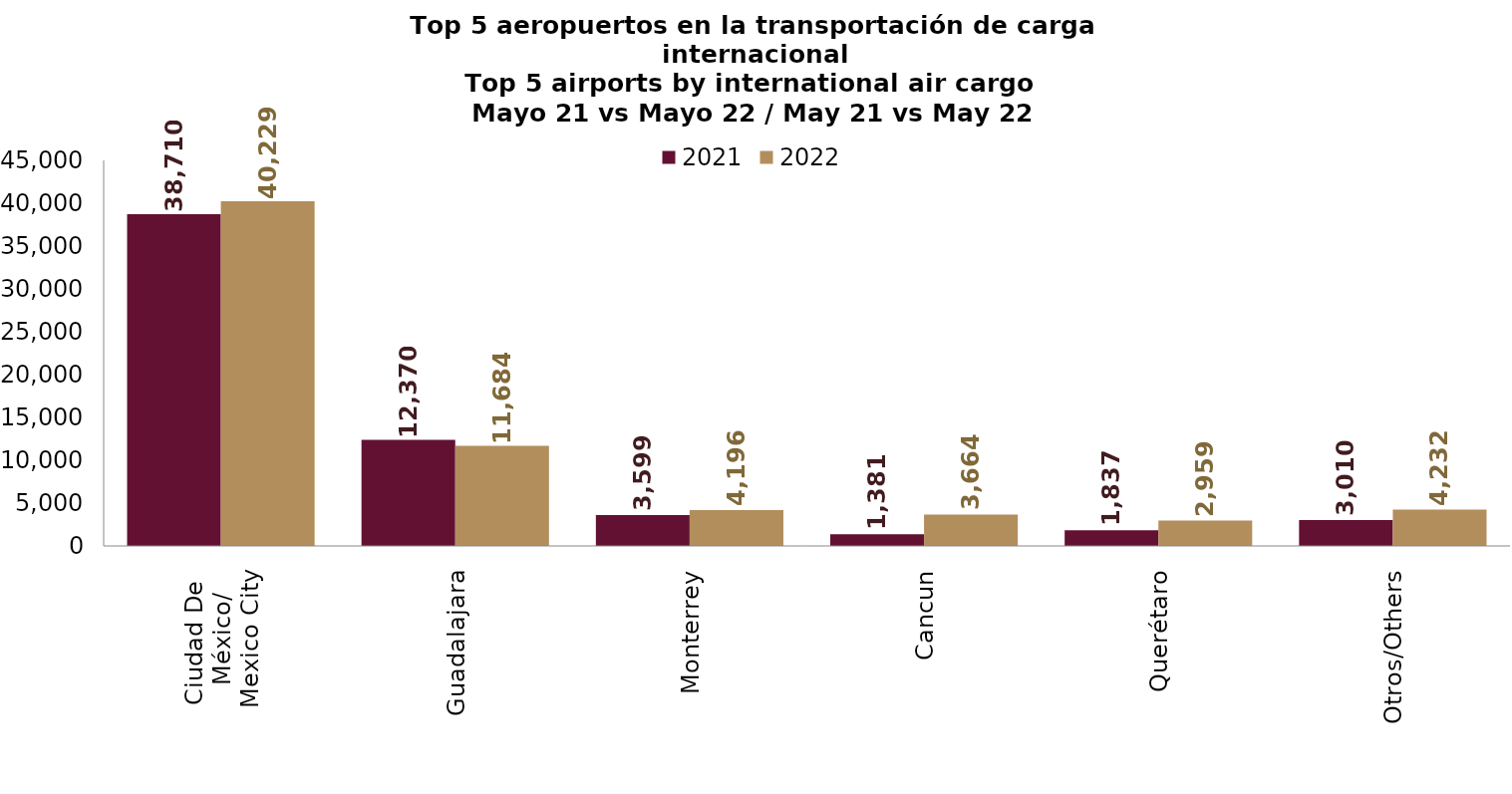
| Category | 2021 | 2022 |
|---|---|---|
| Ciudad De 
México/
Mexico City | 38709.98 | 40229.262 |
| Guadalajara | 12369.645 | 11683.758 |
| Monterrey | 3598.84 | 4195.998 |
| Cancun | 1380.774 | 3664.446 |
| Querétaro | 1836.808 | 2959.071 |
| Otros/Others | 3009.906 | 4232.398 |